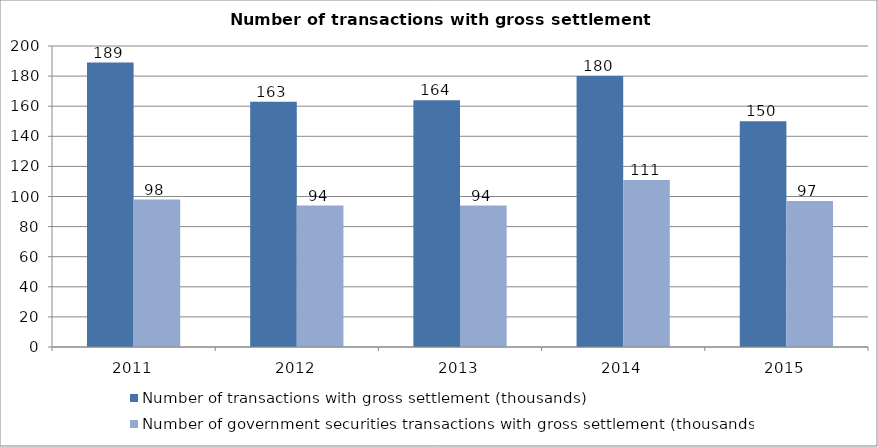
| Category | Number of transactions with gross settlement (thousands) | Number of government securities transactions with gross settlement (thousands) |
|---|---|---|
| 2011.0 | 189 | 98 |
| 2012.0 | 163 | 94 |
| 2013.0 | 164 | 94 |
| 2014.0 | 180 | 111 |
| 2015.0 | 150 | 97 |